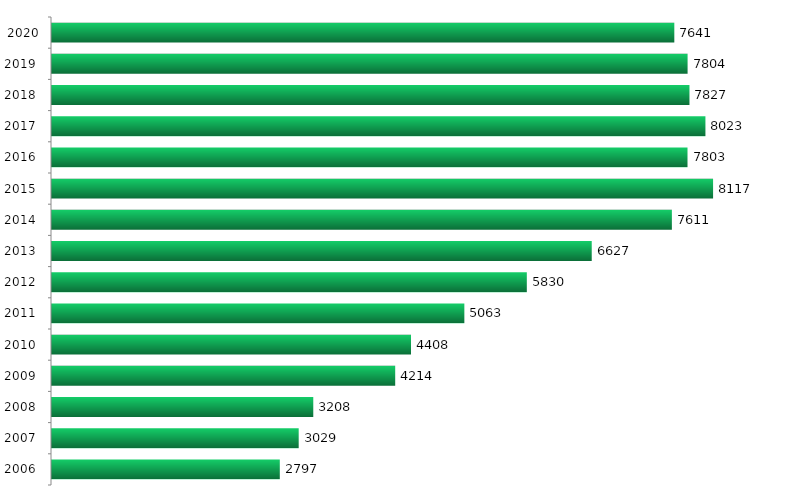
| Category | Series 0 |
|---|---|
| 2006.0 | 2797 |
| 2007.0 | 3029 |
| 2008.0 | 3208 |
| 2009.0 | 4214 |
| 2010.0 | 4408 |
| 2011.0 | 5063 |
| 2012.0 | 5830 |
| 2013.0 | 6627 |
| 2014.0 | 7611 |
| 2015.0 | 8117 |
| 2016.0 | 7803 |
| 2017.0 | 8023 |
| 2018.0 | 7827 |
| 2019.0 | 7804 |
| 2020.0 | 7641 |